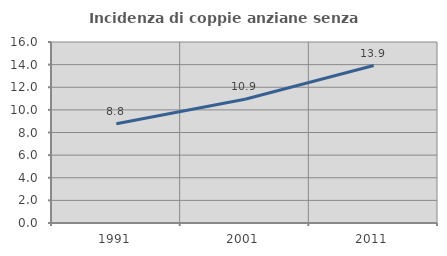
| Category | Incidenza di coppie anziane senza figli  |
|---|---|
| 1991.0 | 8.768 |
| 2001.0 | 10.943 |
| 2011.0 | 13.917 |